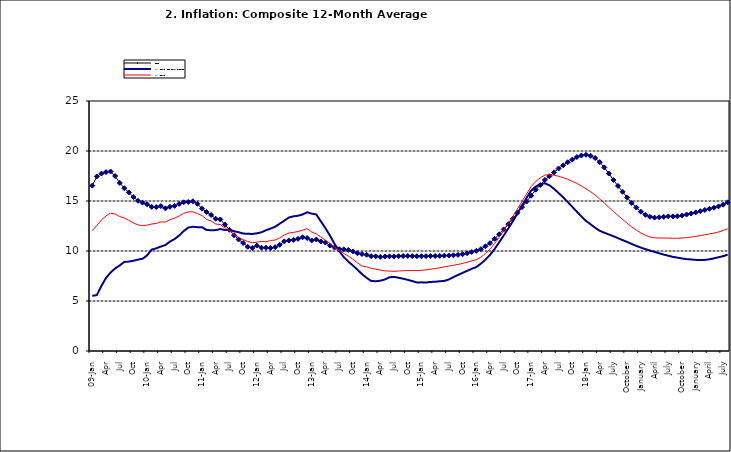
| Category | Food | All Items less Farm Produce | All Items |
|---|---|---|---|
| 09-Jan | 16.536 | 5.519 | 12.032 |
| Feb | 17.454 | 5.591 | 12.567 |
| Mar | 17.742 | 6.51 | 13.101 |
| Apr | 17.89 | 7.302 | 13.51 |
| May | 17.949 | 7.847 | 13.787 |
| June | 17.498 | 8.259 | 13.694 |
| Jul | 16.808 | 8.554 | 13.437 |
| Aug | 16.278 | 8.906 | 13.307 |
| Sep | 15.859 | 8.942 | 13.065 |
| Oct | 15.396 | 9.024 | 12.803 |
| Nov | 15.018 | 9.143 | 12.609 |
| Dec | 14.841 | 9.226 | 12.538 |
| 10-Jan | 14.668 | 9.567 | 12.586 |
| Feb | 14.411 | 10.138 | 12.7 |
| Mar | 14.395 | 10.269 | 12.757 |
| Apr | 14.489 | 10.444 | 12.915 |
| May | 14.266 | 10.597 | 12.893 |
| Jun | 14.424 | 10.948 | 13.132 |
| Jul | 14.514 | 11.193 | 13.284 |
| Aug | 14.706 | 11.549 | 13.5 |
| Sep | 14.872 | 11.997 | 13.764 |
| Oct | 14.906 | 12.345 | 13.908 |
| Nov | 14.967 | 12.423 | 13.928 |
| Dec | 14.723 | 12.383 | 13.74 |
| 11-Jan | 14.233 | 12.385 | 13.542 |
| Feb | 13.903 | 12.099 | 13.161 |
| Mar | 13.606 | 12.077 | 13.001 |
| Apr | 13.227 | 12.088 | 12.694 |
| May | 13.152 | 12.198 | 12.648 |
| Jun | 12.654 | 12.1 | 12.321 |
| Jul | 12.118 | 12.109 | 12.009 |
| Aug | 11.575 | 11.98 | 11.635 |
| Sep | 11.155 | 11.877 | 11.363 |
| Oct | 10.797 | 11.746 | 11.13 |
| Nov | 10.422 | 11.721 | 10.952 |
| Dec | 10.298 | 11.706 | 10.826 |
| 12-Jan | 10.538 | 11.765 | 10.886 |
| 12-Feb | 10.336 | 11.872 | 10.955 |
| 12-Mar | 10.325 | 12.075 | 10.914 |
| Apr | 10.304 | 12.242 | 11.054 |
| May | 10.387 | 12.419 | 11.096 |
| Jun | 10.617 | 12.732 | 11.32 |
| Jul | 10.963 | 13.032 | 11.599 |
| Aug | 11.056 | 13.349 | 11.791 |
| Sep | 11.104 | 13.467 | 11.859 |
| Oct | 11.216 | 13.525 | 11.948 |
| Nov | 11.372 | 13.649 | 12.091 |
| Dec | 11.296 | 13.873 | 12.224 |
| 13-Jan | 11.055 | 13.737 | 11.908 |
| Feb | 11.153 | 13.657 | 11.703 |
| Mar | 10.951 | 12.963 | 11.394 |
| Apr | 10.844 | 12.281 | 11.072 |
| May | 10.548 | 11.531 | 10.761 |
| Jun | 10.352 | 10.704 | 10.383 |
| Jul | 10.186 | 10.005 | 10.047 |
| Aug | 10.168 | 9.4 | 9.761 |
| Sep | 10.105 | 8.939 | 9.486 |
| Oct | 9.955 | 8.553 | 9.167 |
| Nov | 9.774 | 8.136 | 8.815 |
| Dec | 9.695 | 7.691 | 8.496 |
| 14-Jan | 9.626 | 7.317 | 8.408 |
| Feb | 9.484 | 7.005 | 8.257 |
| Mar | 9.464 | 6.976 | 8.19 |
| Apr | 9.416 | 7.03 | 8.092 |
| May | 9.448 | 7.151 | 8.012 |
| Jun | 9.464 | 7.369 | 7.998 |
| Jul | 9.459 | 7.411 | 7.968 |
| Aug | 9.481 | 7.325 | 7.996 |
| Sep | 9.501 | 7.228 | 8.027 |
| Oct | 9.508 | 7.116 | 8.047 |
| Nov | 9.492 | 6.991 | 8.046 |
| Dec | 9.481 | 6.854 | 8.047 |
| 15-Jan | 9.475 | 6.865 | 8.063 |
| Feb | 9.486 | 6.852 | 8.117 |
| Mar | 9.495 | 6.905 | 8.176 |
| Apr | 9.501 | 6.922 | 8.243 |
| May | 9.51 | 6.975 | 8.331 |
| Jun | 9.535 | 7.006 | 8.417 |
| Jul | 9.552 | 7.154 | 8.497 |
| Aug | 9.571 | 7.384 | 8.566 |
| Sep | 9.614 | 7.605 | 8.658 |
| Oct | 9.68 | 7.812 | 8.76 |
| Nov | 9.778 | 8.016 | 8.879 |
| Dec | 9.898 | 8.222 | 9.009 |
| 16-Jan | 10.017 | 8.391 | 9.13 |
| Feb | 10.184 | 8.732 | 9.386 |
| Mar | 10.471 | 9.132 | 9.751 |
| Apr | 10.786 | 9.614 | 10.182 |
| May | 11.221 | 10.196 | 10.746 |
| Jun | 11.672 | 10.864 | 11.372 |
| Jul | 12.162 | 11.553 | 12.045 |
| Aug | 12.696 | 12.247 | 12.744 |
| Sep | 13.238 | 12.98 | 13.454 |
| Oct | 13.817 | 13.757 | 14.206 |
| Nov | 14.386 | 14.542 | 14.958 |
| Dec | 14.946 | 15.307 | 15.697 |
| 17-Jan | 15.536 | 16.042 | 16.441 |
| Feb | 16.127 | 16.436 | 16.958 |
| Mar | 16.598 | 16.682 | 17.315 |
| Apr | 17.106 | 16.772 | 17.591 |
| May | 17.477 | 16.567 | 17.628 |
| Jun | 17.868 | 16.219 | 17.578 |
| Jul | 18.247 | 15.798 | 17.475 |
| Aug | 18.569 | 15.372 | 17.331 |
| Sep | 18.876 | 14.903 | 17.17 |
| Oct | 19.14 | 14.415 | 16.968 |
| Nov | 19.392 | 13.93 | 16.76 |
| Dec | 19.546 | 13.458 | 16.502 |
| 18-Jan | 19.621 | 13.01 | 16.215 |
| Feb | 19.521 | 12.668 | 15.93 |
| Mar | 19.294 | 12.33 | 15.599 |
| Apr | 18.886 | 12.021 | 15.196 |
| May | 18.359 | 11.828 | 14.793 |
| June | 17.745 | 11.651 | 14.371 |
| July | 17.102 | 11.478 | 13.95 |
| August | 16.501 | 11.285 | 13.546 |
| September | 15.923 | 11.092 | 13.157 |
| October | 15.355 | 10.903 | 12.777 |
| November | 14.802 | 10.703 | 12.406 |
| December | 14.348 | 10.514 | 12.095 |
| January | 13.934 | 10.339 | 11.801 |
| February | 13.62 | 10.185 | 11.564 |
| March | 13.42 | 10.044 | 11.401 |
| April | 13.339 | 9.909 | 11.314 |
| May | 13.371 | 9.77 | 11.299 |
| June | 13.418 | 9.64 | 11.297 |
| July | 13.46 | 9.524 | 11.291 |
| August | 13.458 | 9.411 | 11.271 |
| September | 13.474 | 9.337 | 11.268 |
| October | 13.544 | 9.253 | 11.298 |
| November | 13.646 | 9.189 | 11.348 |
| December | 13.743 | 9.155 | 11.396 |
| January | 13.859 | 9.112 | 11.462 |
| February | 13.98 | 9.086 | 11.539 |
| March | 14.109 | 9.112 | 11.624 |
| April | 14.221 | 9.174 | 11.706 |
| May | 14.325 | 9.267 | 11.791 |
| June | 14.46 | 9.375 | 11.904 |
| July | 14.634 | 9.484 | 12.049 |
| August | 14.869 | 9.638 | 12.233 |